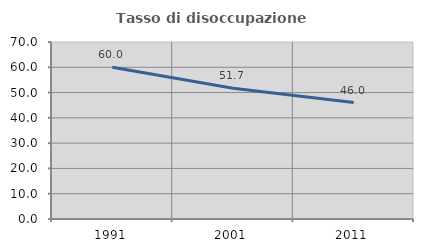
| Category | Tasso di disoccupazione giovanile  |
|---|---|
| 1991.0 | 60 |
| 2001.0 | 51.724 |
| 2011.0 | 46.032 |